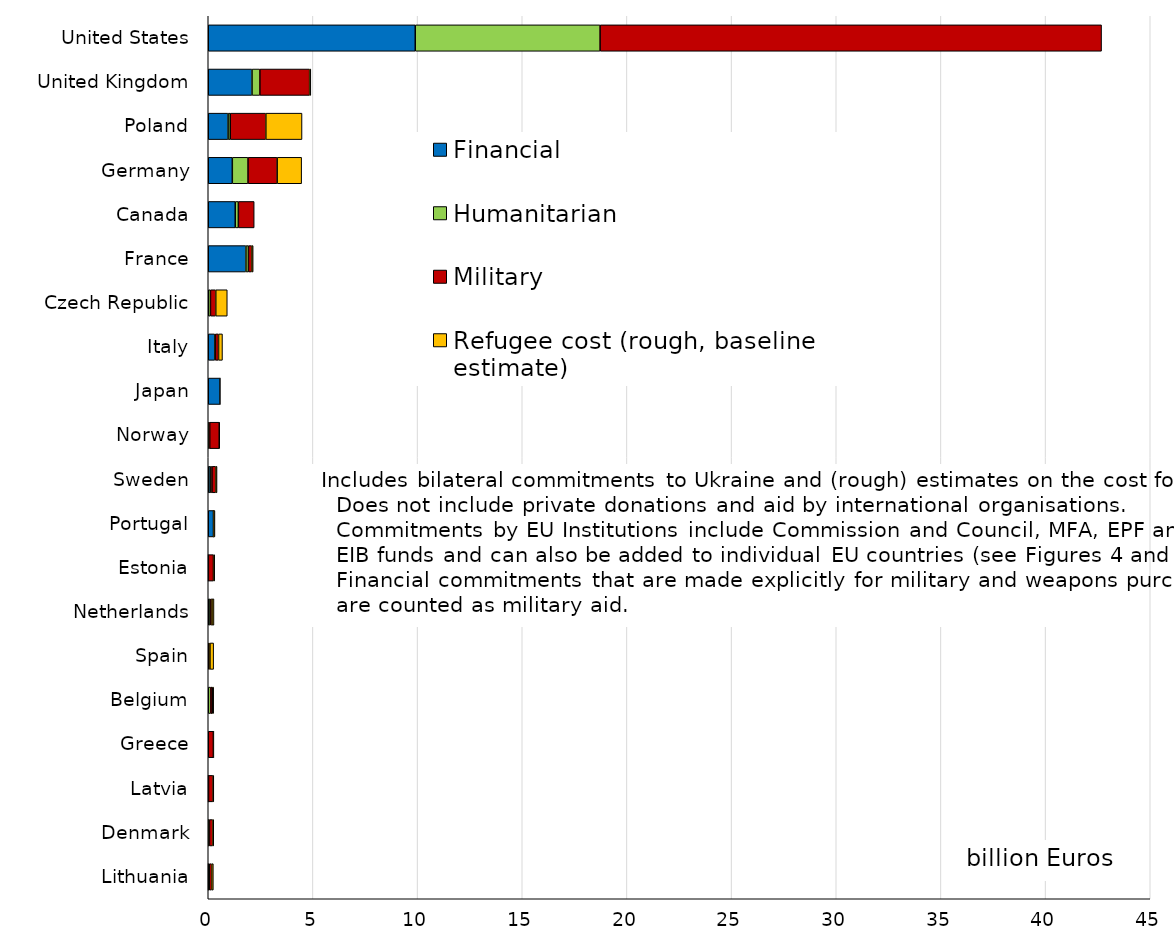
| Category | Financial | Humanitarian | Military | Refugee cost (rough, baseline estimate) |
|---|---|---|---|---|
| United States | 9.889 | 8.83 | 23.955 | 0 |
| United Kingdom | 2.091 | 0.376 | 2.377 | 0.056 |
| Poland | 0.948 | 0.103 | 1.7 | 1.729 |
| Germany | 1.15 | 0.75 | 1.392 | 1.17 |
| Canada | 1.29 | 0.149 | 0.756 | 0 |
| France | 1.8 | 0.119 | 0.162 | 0.065 |
| Czech Republic | 0 | 0.104 | 0.255 | 0.55 |
| Italy | 0.31 | 0.031 | 0.15 | 0.189 |
| Japan | 0.565 | 0.002 | 0 | 0 |
| Norway | 0.034 | 0.036 | 0.455 | 0.025 |
| Sweden | 0.091 | 0.086 | 0.184 | 0.059 |
| Portugal | 0.25 | 0.001 | 0.009 | 0.06 |
| Estonia | 0 | 0.005 | 0.245 | 0.06 |
| Netherlands | 0.08 | 0.027 | 0.071 | 0.094 |
| Spain | 0 | 0.044 | 0.037 | 0.177 |
| Belgium | 0 | 0.116 | 0.076 | 0.069 |
| Greece | 0 | 0 | 0.246 | 0.022 |
| Latvia | 0.01 | 0.001 | 0.219 | 0.035 |
| Denmark | 0.02 | 0.037 | 0.162 | 0.044 |
| Lithuania | 0.005 | 0.042 | 0.116 | 0.081 |